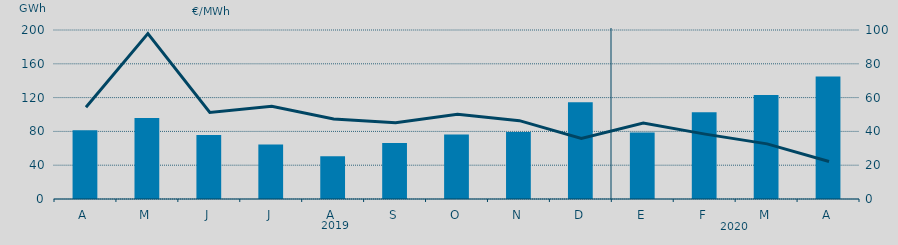
| Category | Energía a subir |
|---|---|
| A | 81.387 |
| M | 95.806 |
| J | 75.708 |
| J | 64.438 |
| A | 50.596 |
| S | 66.317 |
| O | 76.273 |
| N | 79.309 |
| D | 114.385 |
| E | 78.585 |
| F | 102.74 |
| M | 123.158 |
| A | 144.862 |